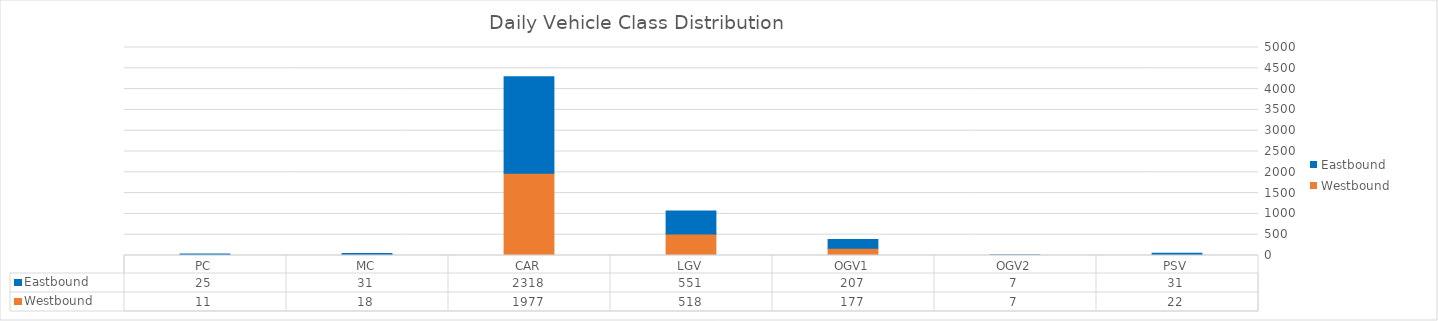
| Category | Westbound | Eastbound |
|---|---|---|
| PC | 11 | 25 |
| MC | 18 | 31 |
| CAR | 1977 | 2318 |
| LGV | 518 | 551 |
| OGV1 | 177 | 207 |
| OGV2 | 7 | 7 |
| PSV | 22 | 31 |